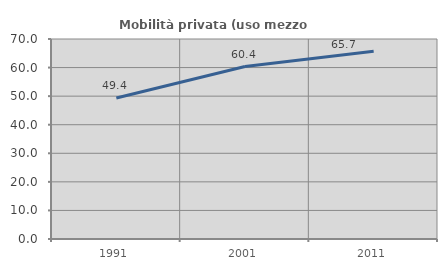
| Category | Mobilità privata (uso mezzo privato) |
|---|---|
| 1991.0 | 49.363 |
| 2001.0 | 60.36 |
| 2011.0 | 65.686 |